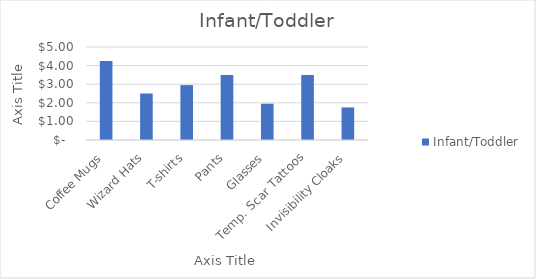
| Category | Infant/Toddler |
|---|---|
| Coffee Mugs | 4.25 |
| Wizard Hats | 2.5 |
| T-shirts | 2.95 |
| Pants | 3.5 |
| Glasses | 1.95 |
| Temp. Scar Tattoos | 3.5 |
| Invisibility Cloaks | 1.75 |